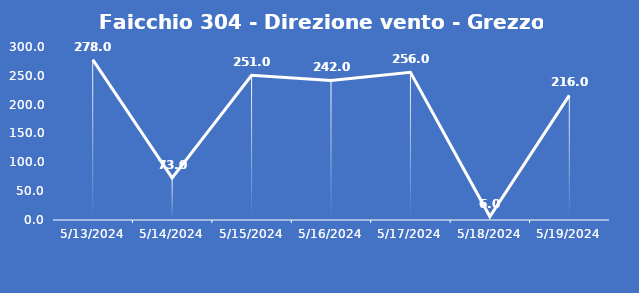
| Category | Faicchio 304 - Direzione vento - Grezzo (°N) |
|---|---|
| 5/13/24 | 278 |
| 5/14/24 | 73 |
| 5/15/24 | 251 |
| 5/16/24 | 242 |
| 5/17/24 | 256 |
| 5/18/24 | 6 |
| 5/19/24 | 216 |